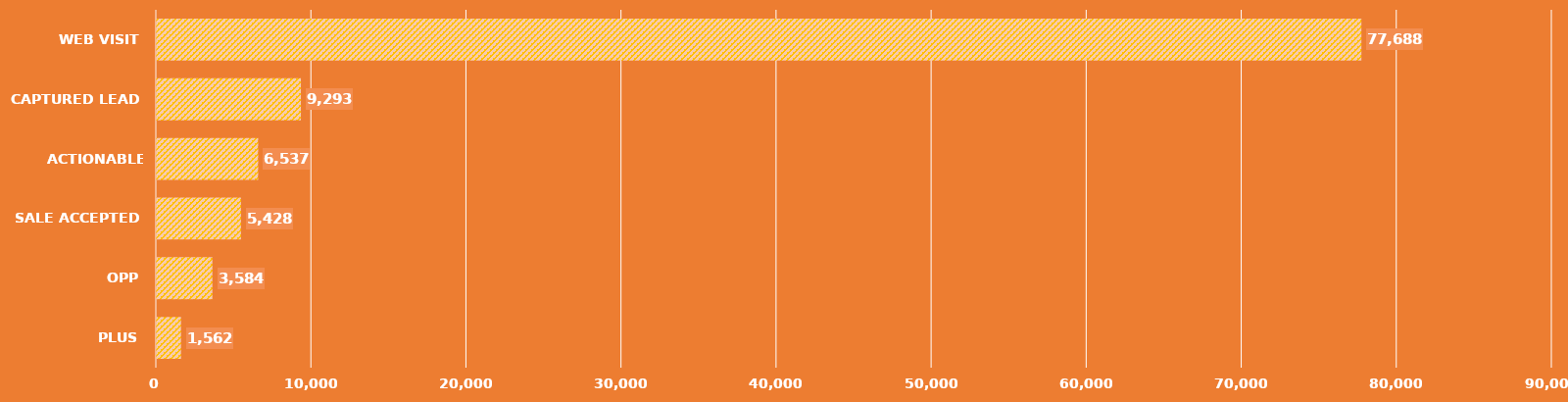
| Category | Series 0 |
|---|---|
| PLUS | 1562 |
| OPP | 3584 |
| SALE ACCEPTED | 5428 |
| ACTIONABLE LEAD | 6537 |
| CAPTURED LEAD | 9293 |
| WEB VISIT | 77688 |